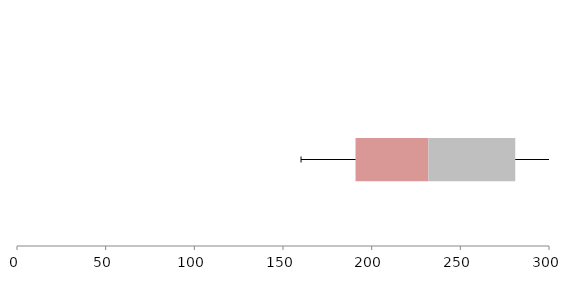
| Category | Series 1 | Series 2 | Series 3 |
|---|---|---|---|
| 0 | 190.91 | 41.064 | 49 |